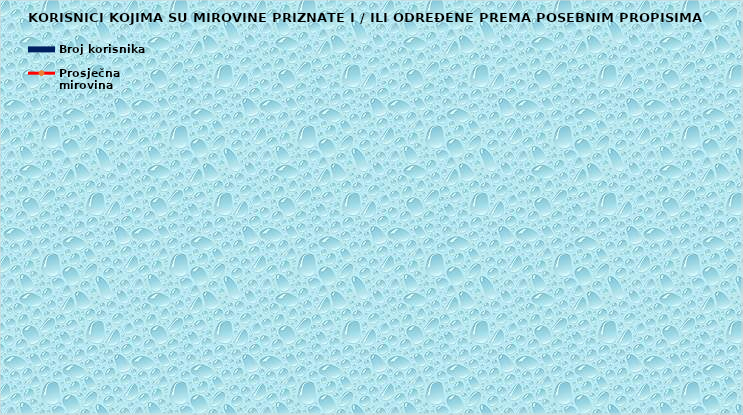
| Category | Broj korisnika |
|---|---|
|      a) radnici na poslovima ovlaštenih službenih osoba u tijelima unutarnjih 
poslova i pravosuđa, kojima je pravo na mirovinu priznato prema propisima
koji su bili na snazi do stupanja na snagu Zakona o pravima iz mirovinskog
osiguranja DVO, PS i OSO | 7701 |
|      b) radnici na  poslovima policijskih službenika, ovlaštenih službenih osoba pravosuđa i službene osobe s posebnim dužnostima i ovlastima u sigurnosno obavještajnom sustavu RH koji su pravo na mirovinu ostvarili prema Zakonu o pravima DVO, PS i OSO | 9044 |
|      c) radnici na poslovima razminiranja | 627 |
| Korisnici koji pravo na mirovinu ostvaruju prema Zakonu o vatrogastvu (NN 125/19)* | 213 |
| Djelatne vojne osobe - DVO  | 15869 |
| Pripadnici Hrvatske domovinske vojske od 1941. do 1945. godine | 2618 |
| Bivši politički zatvorenici | 2369 |
| Hrvatski branitelji iz Domovinskog rata - ZOHBDR | 70820 |
| Mirovine priznate prema općim propisima, a određene prema
ZOHBDR - u iz 2017. (čl. 27., 35., 48. i 49. stavak 2.)  | 52038 |
| Pripadnici bivše Jugoslavenske narodne armije - JNA | 4336 |
| Pripadnici bivše Jugoslavenske narodne armije - JNA - čl. 185 ZOMO | 157 |
| Sudionici Narodnooslobodilačkog rata - NOR | 6580 |
| Zastupnici u Hrvatskom saboru, članovi Vlade, suci Ustavnog suda i glavni državni revizor  | 686 |
| Članovi Izvršnog vijeća Sabora, Saveznog izvršnog vijeća i administrativno umirovljeni javni službenici | 77 |
| Bivši službenici u saveznim tijelima bivše SFRJ - članak 38. ZOMO | 24 |
| Redoviti članovi Hrvatske akademije znanosti i umjetnosti - HAZU | 131 |
| Radnici u Istarskim ugljenokopima "Tupljak" d.d. Labin  | 248 |
| Radnici profesionalno izloženi azbestu | 851 |
| Osiguranici - članovi posade broda u međunarodnoj plovidbi i nacionalnoj plovidbi - članak 129. a stavak 2. Pomorskog zakonika | 198 |
| Pripadnici Hrvatskog vijeća obrane  - HVO  | 6790 |